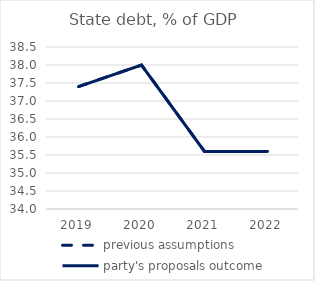
| Category | previous assumptions | party's proposals outcome |
|---|---|---|
| 2019.0 | 37.4 | 37.4 |
| 2020.0 | 38 | 38 |
| 2021.0 | 35.6 | 35.6 |
| 2022.0 | 35.6 | 35.6 |